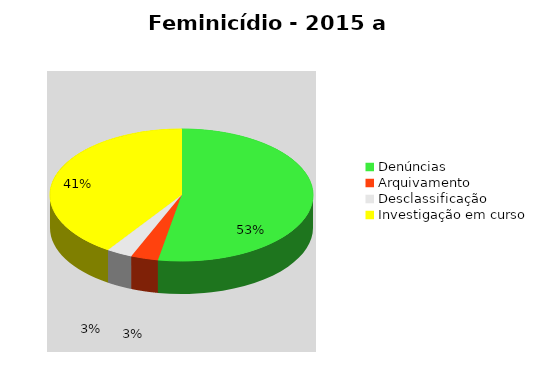
| Category | Linha 29 |
|---|---|
| Denúncias | 1420 |
| Arquivamento | 90 |
| Desclassificação | 86 |
| Investigação em curso | 1090 |